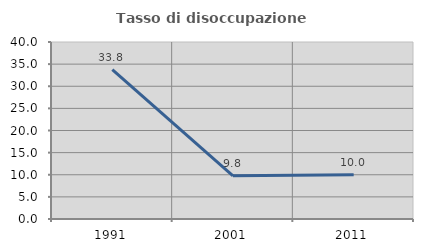
| Category | Tasso di disoccupazione giovanile  |
|---|---|
| 1991.0 | 33.784 |
| 2001.0 | 9.756 |
| 2011.0 | 10 |